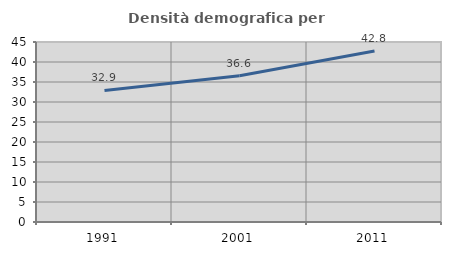
| Category | Densità demografica |
|---|---|
| 1991.0 | 32.901 |
| 2001.0 | 36.586 |
| 2011.0 | 42.766 |